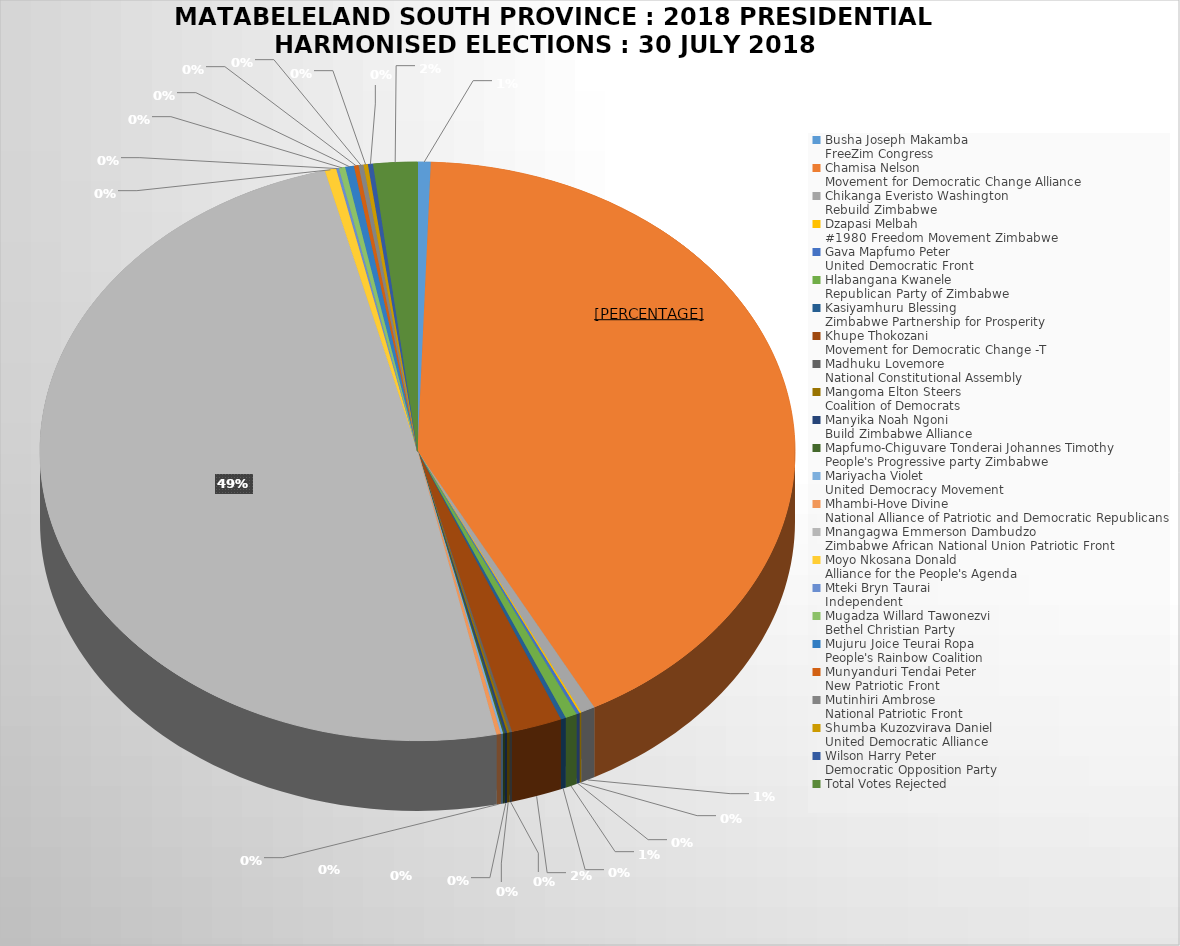
| Category | Series 0 |
|---|---|
| Busha Joseph Makamba
FreeZim Congress | 1216 |
| Chamisa Nelson
Movement for Democratic Change Alliance | 90292 |
| Chikanga Everisto Washington
Rebuild Zimbabwe | 1335 |
| Dzapasi Melbah
#1980 Freedom Movement Zimbabwe | 170 |
| Gava Mapfumo Peter
United Democratic Front | 304 |
| Hlabangana Kwanele
Republican Party of Zimbabwe | 1085 |
| Kasiyamhuru Blessing
Zimbabwe Partnership for Prosperity | 480 |
| Khupe Thokozani
Movement for Democratic Change -T | 4698 |
| Madhuku Lovemore
National Constitutional Assembly | 249 |
| Mangoma Elton Steers
Coalition of Democrats | 215 |
| Manyika Noah Ngoni
Build Zimbabwe Alliance | 222 |
| Mapfumo-Chiguvare Tonderai Johannes Timothy
People's Progressive party Zimbabwe | 158 |
| Mariyacha Violet
United Democracy Movement | 209 |
| Mhambi-Hove Divine
National Alliance of Patriotic and Democratic Republicans | 404 |
| Mnangagwa Emmerson Dambudzo
Zimbabwe African National Union Patriotic Front | 107008 |
| Moyo Nkosana Donald
Alliance for the People's Agenda | 1060 |
| Mteki Bryn Taurai
Independent | 255 |
| Mugadza Willard Tawonezvi
Bethel Christian Party | 590 |
| Mujuru Joice Teurai Ropa
People's Rainbow Coalition | 808 |
| Munyanduri Tendai Peter
New Patriotic Front | 429 |
| Mutinhiri Ambrose
National Patriotic Front | 456 |
| Shumba Kuzozvirava Daniel
United Democratic Alliance | 411 |
| Wilson Harry Peter
Democratic Opposition Party | 461 |
| Total Votes Rejected  | 4080 |